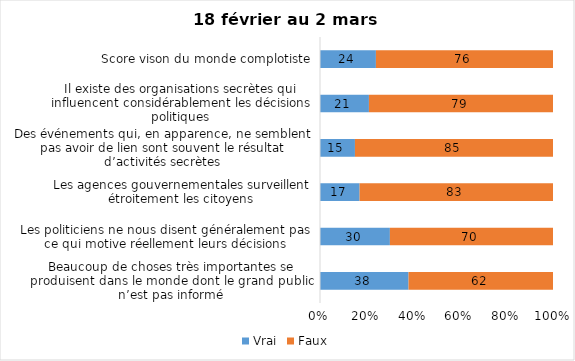
| Category | Vrai | Faux |
|---|---|---|
| Beaucoup de choses très importantes se produisent dans le monde dont le grand public n’est pas informé | 38 | 62 |
| Les politiciens ne nous disent généralement pas ce qui motive réellement leurs décisions | 30 | 70 |
| Les agences gouvernementales surveillent étroitement les citoyens | 17 | 83 |
| Des événements qui, en apparence, ne semblent pas avoir de lien sont souvent le résultat d’activités secrètes | 15 | 85 |
| Il existe des organisations secrètes qui influencent considérablement les décisions politiques | 21 | 79 |
| Score vison du monde complotiste | 24 | 76 |